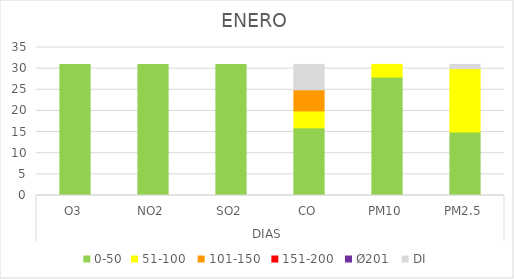
| Category | 0-50 | 51-100  | 101-150  | 151-200  | Ø201  | DI |
|---|---|---|---|---|---|---|
| 0 | 31 | 0 | 0 | 0 | 0 | 0 |
| 1 | 31 | 0 | 0 | 0 | 0 | 0 |
| 2 | 31 | 0 | 0 | 0 | 0 | 0 |
| 3 | 16 | 4 | 5 | 0 | 0 | 6 |
| 4 | 28 | 3 | 0 | 0 | 0 | 0 |
| 5 | 15 | 15 | 0 | 0 | 0 | 1 |